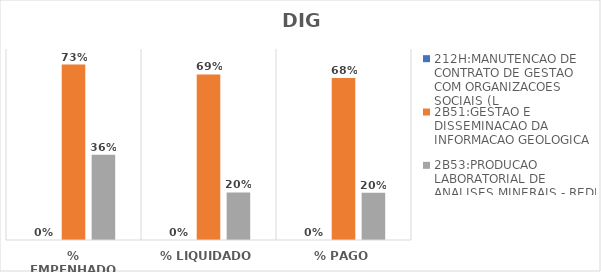
| Category | 212H:MANUTENCAO DE CONTRATO DE GESTAO COM ORGANIZACOES SOCIAIS (L | 2B51:GESTAO E DISSEMINACAO DA INFORMACAO GEOLOGICA | 2B53:PRODUCAO LABORATORIAL DE ANALISES MINERAIS - REDE LAMIN |
|---|---|---|---|
| % EMPENHADO | 0 | 0.735 | 0.357 |
| % LIQUIDADO | 0 | 0.694 | 0.199 |
| % PAGO | 0 | 0.678 | 0.197 |